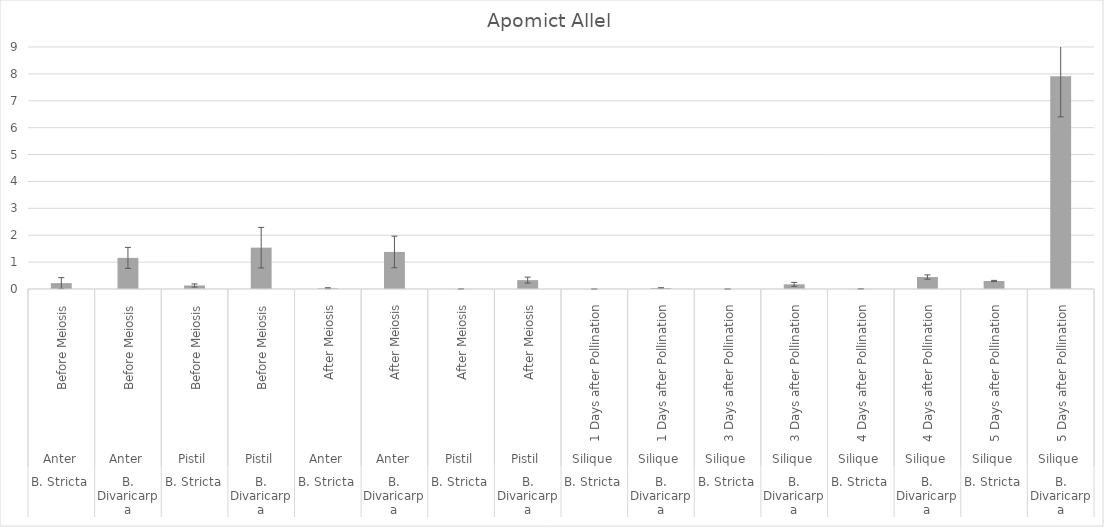
| Category | Series 0 |
|---|---|
| 0 | 0.218 |
| 1 | 1.158 |
| 2 | 0.131 |
| 3 | 1.538 |
| 4 | 0.029 |
| 5 | 1.378 |
| 6 | 0.003 |
| 7 | 0.33 |
| 8 | 0 |
| 9 | 0.037 |
| 10 | 0.001 |
| 11 | 0.174 |
| 12 | 0.004 |
| 13 | 0.445 |
| 14 | 0.298 |
| 15 | 7.914 |